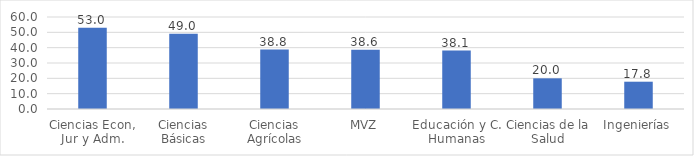
| Category | Series 0 |
|---|---|
| Ciencias Econ, Jur y Adm. | 53 |
| Ciencias Básicas | 49 |
| Ciencias Agrícolas | 38.8 |
| MVZ | 38.6 |
| Educación y C. Humanas | 38.1 |
| Ciencias de la Salud | 20 |
| Ingenierías | 17.8 |